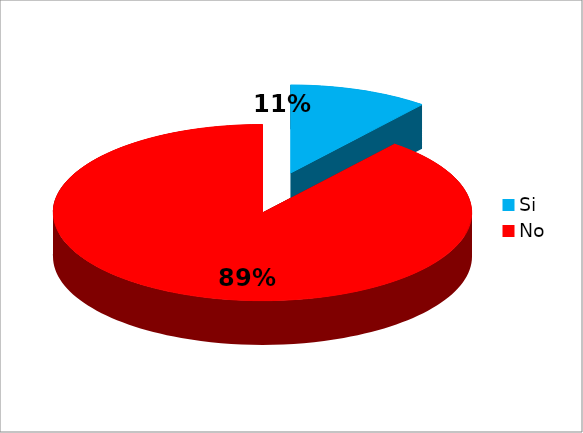
| Category | Series 0 |
|---|---|
| Si | 8 |
| No | 66 |